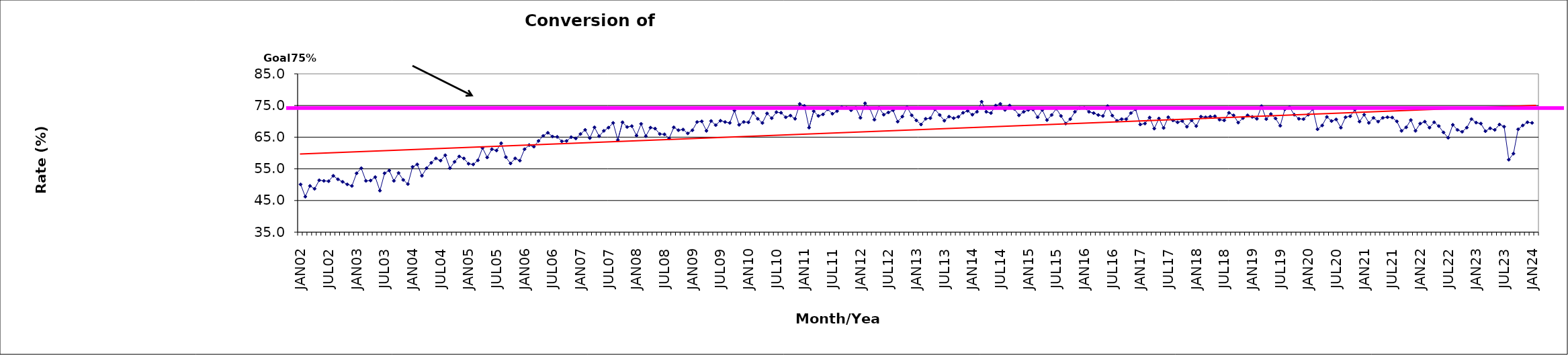
| Category | Series 0 |
|---|---|
| JAN02 | 50.1 |
| FEB02 | 46.2 |
| MAR02 | 49.6 |
| APR02 | 48.7 |
| MAY02 | 51.4 |
| JUN02 | 51.2 |
| JUL02 | 51.1 |
| AUG02 | 52.8 |
| SEP02 | 51.7 |
| OCT02 | 50.9 |
| NOV02 | 50.1 |
| DEC02 | 49.6 |
| JAN03 | 53.6 |
| FEB03 | 55.2 |
| MAR03 | 51.2 |
| APR03 | 51.3 |
| MAY03 | 52.4 |
| JUN03 | 48.1 |
| JUL03 | 53.6 |
| AUG03 | 54.5 |
| SEP03 | 51.2 |
| OCT03 | 53.7 |
| NOV03 | 51.5 |
| DEC03 | 50.2 |
| JAN04 | 55.6 |
| FEB04 | 56.4 |
| MAR04 | 52.8 |
| APR04 | 55.2 |
| MAY04 | 56.9 |
| JUN04 | 58.3 |
| JUL04 | 57.6 |
| AUG04 | 59.3 |
| SEP04 | 55.2 |
| OCT04 | 57.2 |
| NOV04 | 58.9 |
| DEC04 | 58.3 |
| JAN05 | 56.6 |
| FEB05 | 56.4 |
| MAR05 | 57.7 |
| APR05 | 61.6 |
| MAY05 | 58.6 |
| JUN05 | 61.2 |
| JUL05 | 60.8 |
| AUG05 | 63.1 |
| SEP05 | 58.7 |
| OCT05 | 56.7 |
| NOV05 | 58.3 |
| DEC05 | 57.6 |
| JAN06 | 61.2 |
| FEB06 | 62.5 |
| MAR06 | 62 |
| APR06 | 63.8 |
| MAY06 | 65.4 |
| JUN06 | 66.4 |
| JUL06 | 65.2 |
| AUG06 | 65.1 |
| SEP06 | 63.7 |
| OCT06 | 63.8 |
| NOV06 | 65 |
| DEC06 | 64.6 |
| JAN07 | 66 |
| FEB07 | 67.3 |
| MAR07 | 64.7 |
| APR07 | 68.1 |
| MAY07 | 65.3 |
| JUN07 | 67 |
| JUL07 | 68 |
| AUG07 | 69.5 |
| SEP07 | 64.1 |
| OCT07 | 69.7 |
| NOV07 | 68.2 |
| DEC07 | 68.5 |
| JAN08 | 65.5 |
| FEB08 | 69.2 |
| MAR08 | 65.3 |
| APR08 | 68 |
| MAY08 | 67.7 |
| JUN08 | 66 |
| JUL08 | 65.9 |
| AUG08 | 64.6 |
| SEP08 | 68.1 |
| OCT08 | 67.2 |
| NOV08 | 67.4 |
| DEC08 | 66.2 |
| JAN09 | 67.2 |
| FEB09 | 69.8 |
| MAR09 | 70 |
| APR09 | 67 |
| MAY09 | 70.1 |
| JUN09 | 68.8 |
| JUL09 | 70.2 |
| AUG09 | 69.8 |
| SEP09 | 69.5 |
| OCT09 | 73.4 |
| NOV09 | 68.9 |
| DEC09 | 69.8 |
| JAN10 | 69.7 |
| FEB10 | 72.7 |
| MAR10 | 70.8 |
| APR10 | 69.5 |
| MAY10 | 72.5 |
| JUN10 | 71 |
| JUL10 | 72.9 |
| AUG10 | 72.7 |
| SEP10 | 71.3 |
| OCT10 | 71.8 |
| NOV10 | 70.8 |
| DEC10 | 75.5 |
| JAN11 | 74.9 |
| FEB11 | 68 |
| MAR11 | 73.2 |
| APR11 | 71.7 |
| MAY11 | 72.2 |
| JUN11 | 73.8 |
| JUL11 | 72.4 |
| AUG11 | 73.2 |
| SEP11 | 74.5 |
| OCT11 | 74.3 |
| NOV11 | 73.5 |
| DEC11 | 74.3 |
| JAN12 | 71.1 |
| FEB12 | 75.7 |
| MAR12 | 74.1 |
| APR12 | 70.5 |
| MAY12 | 74.3 |
| JUN12 | 72.1 |
| JUL12 | 72.8 |
| AUG12 | 73.5 |
| SEP12 | 69.9 |
| OCT12 | 71.5 |
| NOV12 | 74.5 |
| DEC12 | 71.9 |
| JAN13 | 70.3 |
| FEB13 | 69 |
| MAR13 | 70.8 |
| APR13 | 71 |
| MAY13 | 73.8 |
| JUN13 | 72 |
| JUL13 | 70.2 |
| AUG13 | 71.5 |
| SEP13 | 71 |
| OCT13 | 71.4 |
| NOV13 | 72.7 |
| DEC13 | 73.3 |
| JAN14 | 72.1 |
| FEB14 | 73 |
| MAR14 | 76.2 |
| APR14 | 73 |
| MAY14 | 72.6 |
| JUN14 | 75 |
| JUL14 | 75.5 |
| AUG14 | 73.6 |
| SEP14 | 75 |
| OCT14 | 73.9 |
| NOV14 | 71.9 |
| DEC14 | 73 |
| JAN15 | 73.6 |
| FEB15 | 73.7 |
| MAR15 | 71.3 |
| APR15 | 73.6 |
| MAY15 | 70.4 |
| JUN15 | 72 |
| JUL15 | 74 |
| AUG15 | 71.7 |
| SEP15 | 69.3 |
| OCT15 | 70.7 |
| NOV15 | 73 |
| DEC15 | 74.2 |
| JAN16 | 74.3 |
| FEB16 | 73 |
| MAR16 | 72.6 |
| APR16 | 72 |
| MAY16 | 71.7 |
| JUN16 | 74.8 |
| JUL16 | 71.8 |
| AUG16 | 70.2 |
| SEP16 | 70.7 |
| OCT16 | 70.7 |
| NOV16 | 72.6 |
| DEC16 | 73.8 |
| JAN17 | 69 |
| FEB17 | 69.3 |
| MAR17 | 71.2 |
| APR17 | 67.7 |
| MAY17 | 70.9 |
| JUN17 | 67.9 |
| JUL17 | 71.3 |
| AUG17 | 70.3 |
| SEP17 | 69.7 |
| OCT17 | 70.1 |
| NOV17 | 68.3 |
| DEC17 | 70.3 |
| JAN18 | 68.5 |
| FEB18 | 71.5 |
| MAR18 | 71.3 |
| APR18 | 71.5 |
| MAY18 | 71.6 |
| JUN18 | 70.5 |
| JUL18 | 70.3 |
| AUG18 | 72.7 |
| SEP18 | 71.9 |
| OCT18 | 69.6 |
| NOV18 | 71 |
| DEC18 | 71.9 |
| JAN19 | 71.4 |
| FEB19 | 70.8 |
| MAR19 | 74.8 |
| APR19 | 70.7 |
| MAY19 | 72.3 |
| JUN19 | 70.9 |
| JUL19 | 68.6 |
| AUG19 | 73.8 |
| SEP19 | 74.5 |
| OCT19 | 72.1 |
| NOV19 | 70.8 |
| DEC19 | 70.7 |
| JAN20 | 72.1 |
| FEB20 | 73.9 |
| MAR20 | 67.5 |
| APR20 | 68.7 |
| MAY20 | 71.4 |
| JUN20 | 70.1 |
| JUL20 | 70.6 |
| AUG20 | 68 |
| SEP20 | 71.3 |
| OCT20 | 71.6 |
| NOV20 | 73.7 |
| DEC20 | 69.9 |
| JAN21 | 72.1 |
| FEB21 | 69.5 |
| MAR21 | 71.1 |
| APR21 | 69.9 |
| MAY21 | 71.1 |
| JUN21 | 71.3 |
| JUL21 | 71.2 |
| AUG21 | 70 |
| SEP21 | 67 |
| OCT21 | 68.1 |
| NOV21 | 70.4 |
| DEC21 | 67 |
| JAN22 | 69.3 |
| FEB22 | 69.9 |
| MAR22 | 68 |
| APR22 | 69.7 |
| MAY22 | 68.5 |
| JUN22 | 66.5 |
| JUL22 | 64.8 |
| AUG22 | 68.9 |
| SEP22 | 67.3 |
| OCT22 | 66.7 |
| NOV22 | 68 |
| DEC22 | 70.7 |
| JAN23 | 69.6 |
| FEB23 | 69.3 |
| MAR23 | 66.9 |
| APR23 | 67.8 |
| MAY23 | 67.3 |
| JUN23 | 69 |
| JUL23 | 68.3 |
| AUG23 | 57.9 |
| SEP23 | 59.8 |
| OCT23 | 67.5 |
| NOV23 | 68.7 |
| DEC23 | 69.7 |
| JAN24 | 69.5 |